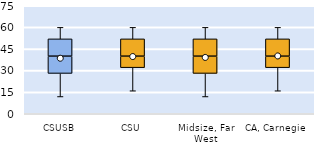
| Category | 25th | 50th | 75th |
|---|---|---|---|
| CSUSB | 28 | 12 | 12 |
| CSU | 32 | 8 | 12 |
| Midsize, Far West | 28 | 12 | 12 |
| CA, Carnegie | 32 | 8 | 12 |